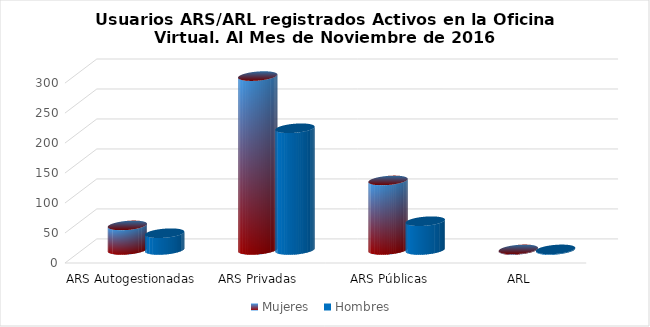
| Category | Mujeres | Hombres |
|---|---|---|
| ARS Autogestionadas | 41 | 28 |
| ARS Privadas | 290 | 203 |
| ARS Públicas | 116 | 48 |
| ARL | 1 | 1 |